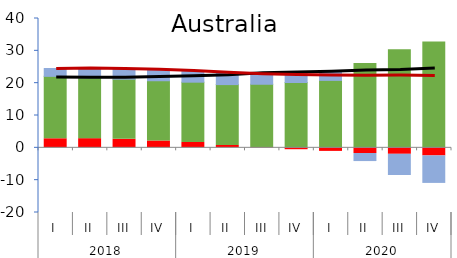
| Category | Ahorro externo | Ahorro privado | Ahorro público |
|---|---|---|---|
| 0 | 2.801 | 19.309 | 2.424 |
| 1 | 2.837 | 18.827 | 2.865 |
| 2 | 2.647 | 18.588 | 3.105 |
| 3 | 2.116 | 18.631 | 3.304 |
| 4 | 1.642 | 18.662 | 3.492 |
| 5 | 0.724 | 18.836 | 3.637 |
| 6 | -0.111 | 19.662 | 3.376 |
| 7 | -0.582 | 20.213 | 3.095 |
| 8 | -1.098 | 20.855 | 2.68 |
| 9 | -1.759 | 26.083 | -2.181 |
| 10 | -1.998 | 30.337 | -6.254 |
| 11 | -2.503 | 32.748 | -8.19 |